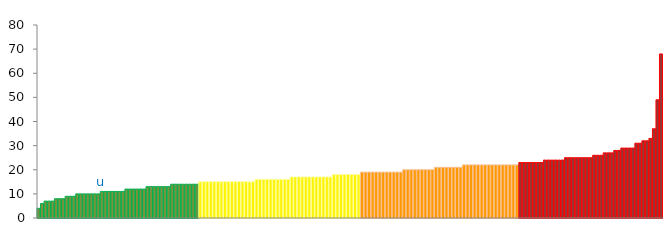
| Category | Top Quartile | 2nd Quartile | 3rd Quartile | Bottom Quartile | Series 4 |
|---|---|---|---|---|---|
|  | 4 | 0 | 0 | 0 | 4 |
|  | 6 | 0 | 0 | 0 | 6 |
|  | 7 | 0 | 0 | 0 | 7 |
|  | 7 | 0 | 0 | 0 | 7 |
|  | 7 | 0 | 0 | 0 | 7 |
|  | 8 | 0 | 0 | 0 | 8 |
|  | 8 | 0 | 0 | 0 | 8 |
|  | 8 | 0 | 0 | 0 | 8 |
|  | 9 | 0 | 0 | 0 | 9 |
|  | 9 | 0 | 0 | 0 | 9 |
|  | 9 | 0 | 0 | 0 | 9 |
|  | 10 | 0 | 0 | 0 | 10 |
|  | 10 | 0 | 0 | 0 | 10 |
|  | 10 | 0 | 0 | 0 | 10 |
|  | 10 | 0 | 0 | 0 | 10 |
|  | 10 | 0 | 0 | 0 | 10 |
|  | 10 | 0 | 0 | 0 | 10 |
|  | 10 | 0 | 0 | 0 | 10 |
| u | 11 | 0 | 0 | 0 | 11 |